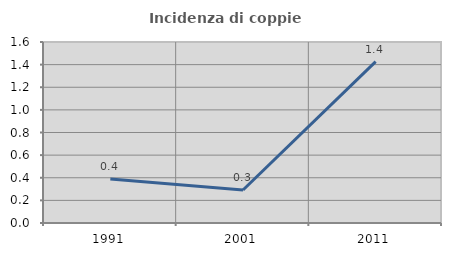
| Category | Incidenza di coppie miste |
|---|---|
| 1991.0 | 0.389 |
| 2001.0 | 0.292 |
| 2011.0 | 1.426 |